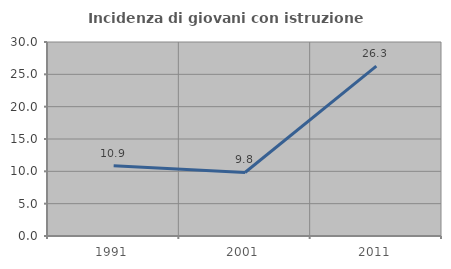
| Category | Incidenza di giovani con istruzione universitaria |
|---|---|
| 1991.0 | 10.87 |
| 2001.0 | 9.821 |
| 2011.0 | 26.263 |